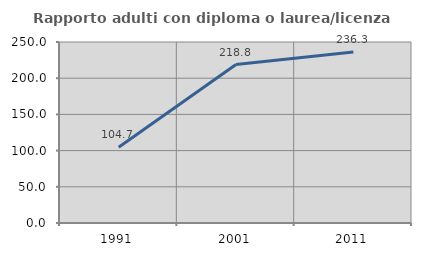
| Category | Rapporto adulti con diploma o laurea/licenza media  |
|---|---|
| 1991.0 | 104.698 |
| 2001.0 | 218.818 |
| 2011.0 | 236.288 |